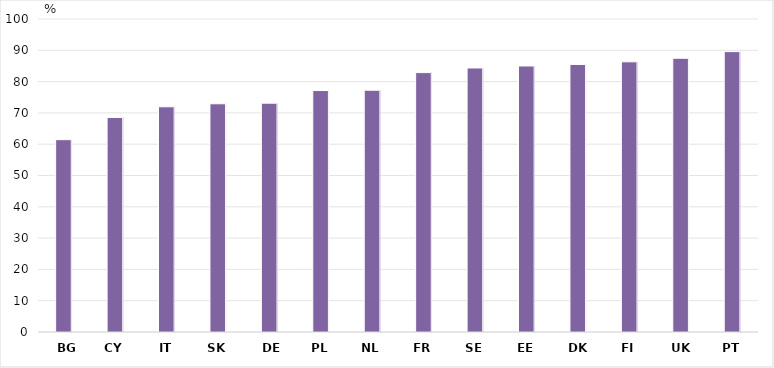
| Category | Total |
|---|---|
| BG | 61.449 |
| CY | 68.539 |
| IT | 71.952 |
| SK | 72.917 |
| DE | 73.105 |
| PL | 77.144 |
| NL | 77.246 |
| FR | 82.869 |
| SE | 84.354 |
| EE | 84.987 |
| DK | 85.472 |
| FI | 86.322 |
| UK | 87.457 |
| PT | 89.58 |